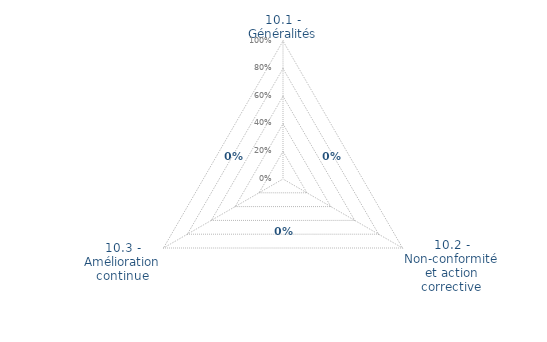
| Category | Art. 10 | limite de CONFORMITÉ |
|---|---|---|
| 10.1 - Généralités | 0 | 0 |
| 10.2 - Non-conformité et action corrective | 0 | 0 |
| 10.3 - Amélioration continue | 0 | 0 |